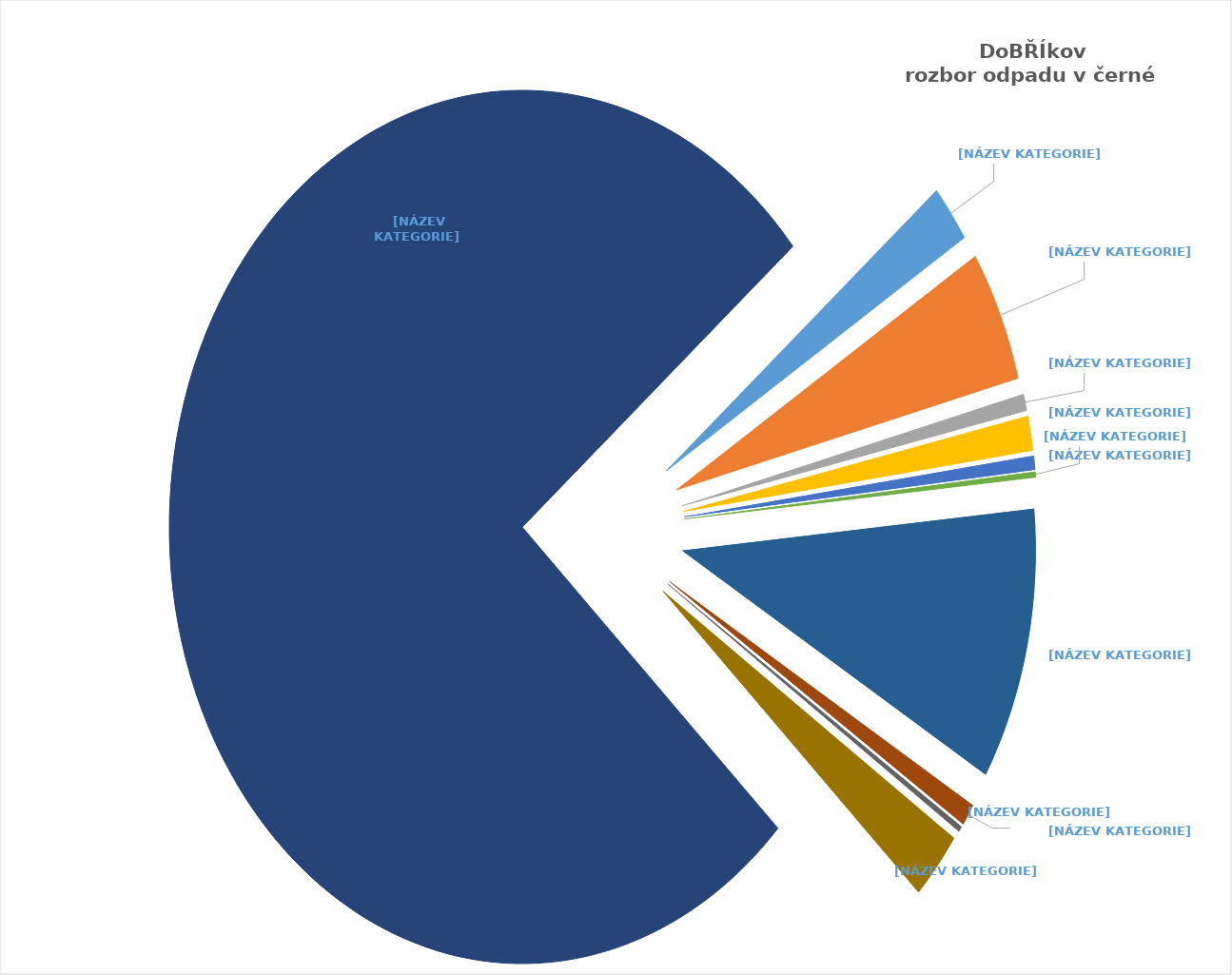
| Category | Series 0 |
|---|---|
| CELKEM BIOLOGICKY ROZLOŽITELNÝ ODPAD | 2.129 |
| CELEKEM PLAST | 4.866 |
| CELKEM PAPÍR | 0.608 |
| SKLO | 1.267 |
| ELEKTROODPAD | 0.507 |
| DŘEVO, DŘEVOTŘÍSKA | 0.203 |
| TEXTIL, BOTY | 10.086 |
| KOV | 0.811 |
| NÁPOJOVÉ KARTONY | 0.203 |
| STAVEBNÍ ODPAD / KAMENY | 2.534 |
| CELKEM SMĚSNÝ KOMUNÁLNÍ ODPAD | 76.736 |